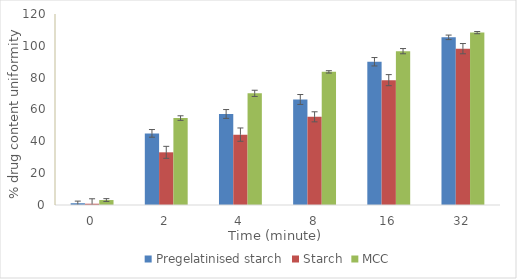
| Category | Pregelatinised starch | Starch | MCC |
|---|---|---|---|
| 0.0 | 1.11 | 0.8 | 3.11 |
| 2.0 | 45 | 33.1 | 54.61 |
| 4.0 | 57.2 | 44.21 | 70.14 |
| 8.0 | 66.3 | 55.4 | 83.64 |
| 16.0 | 90 | 78.44 | 96.65 |
| 32.0 | 105.34 | 98.22 | 108.3 |